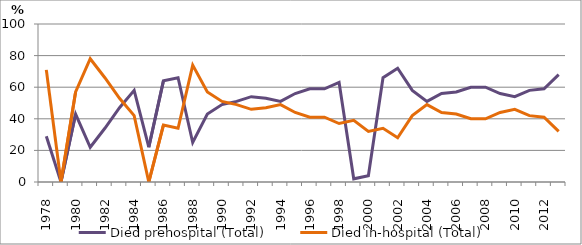
| Category | Died prehospital (Total) | Died in-hospital (Total) |
|---|---|---|
| 1978.0 | 29 | 71 |
| 1979.0 | 0 | 0 |
| 1980.0 | 43 | 57 |
| 1981.0 | 22 | 78 |
| 1982.0 | 34 | 66 |
| 1983.0 | 47 | 53 |
| 1984.0 | 58 | 42 |
| 1985.0 | 22 | 0 |
| 1986.0 | 64 | 36 |
| 1987.0 | 66 | 34 |
| 1988.0 | 25 | 74 |
| 1989.0 | 43 | 57 |
| 1990.0 | 49 | 51 |
| 1991.0 | 51 | 49 |
| 1992.0 | 54 | 46 |
| 1993.0 | 53 | 47 |
| 1994.0 | 51 | 49 |
| 1995.0 | 56 | 44 |
| 1996.0 | 59 | 41 |
| 1997.0 | 59 | 41 |
| 1998.0 | 63 | 37 |
| 1999.0 | 2 | 39 |
| 2000.0 | 4 | 32 |
| 2001.0 | 66 | 34 |
| 2002.0 | 72 | 28 |
| 2003.0 | 58 | 42 |
| 2004.0 | 51 | 49 |
| 2005.0 | 56 | 44 |
| 2006.0 | 57 | 43 |
| 2007.0 | 60 | 40 |
| 2008.0 | 60 | 40 |
| 2009.0 | 56 | 44 |
| 2010.0 | 54 | 46 |
| 2011.0 | 58 | 42 |
| 2012.0 | 59 | 41 |
| 2013.0 | 68 | 32 |